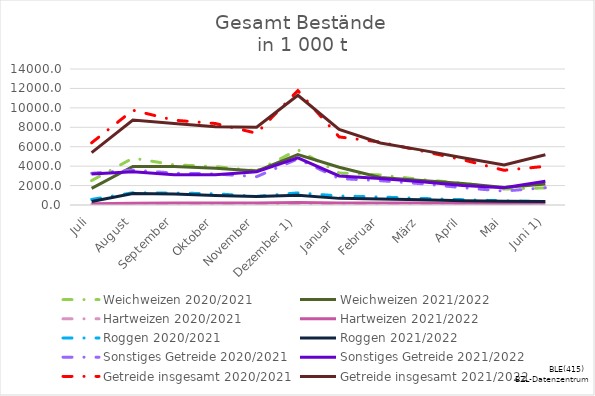
| Category | Weichweizen | Hartweizen | Roggen | Sonstiges Getreide | Getreide insgesamt |
|---|---|---|---|---|---|
| Juli | 1717.17 | 121.118 | 360.803 | 3190.044 | 5389.135 |
| August | 3965.506 | 182.818 | 1174.604 | 3429.161 | 8752.089 |
| September | 3967.264 | 204.338 | 1121.168 | 3105.649 | 8398.419 |
| Oktober | 3778.139 | 208.414 | 967.494 | 3104.404 | 8058.452 |
| November | 3495.718 | 215.97 | 873.688 | 3419.629 | 8005.005 |
| Dezember 1) | 5181.16 | 254.09 | 1008.716 | 4854.128 | 11298.094 |
| Januar  | 3883.791 | 208.605 | 682.249 | 2995.204 | 7769.848 |
| Februar | 2828.825 | 212.266 | 617.39 | 2725.72 | 6384.202 |
| März | 2518.058 | 198.804 | 529.671 | 2401.541 | 5648.074 |
| April | 2223.301 | 180.839 | 436.363 | 2013.371 | 4853.874 |
| Mai | 1804.131 | 165.76 | 374.854 | 1785.47 | 4130.216 |
| Juni 1) | 2155.785 | 191.189 | 364.791 | 2453.116 | 5164.881 |